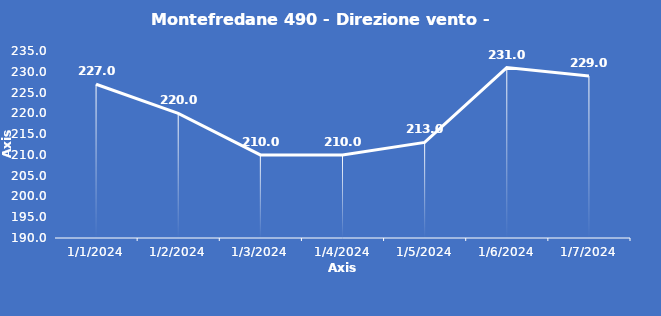
| Category | Montefredane 490 - Direzione vento - Grezzo (°N) |
|---|---|
| 1/1/24 | 227 |
| 1/2/24 | 220 |
| 1/3/24 | 210 |
| 1/4/24 | 210 |
| 1/5/24 | 213 |
| 1/6/24 | 231 |
| 1/7/24 | 229 |